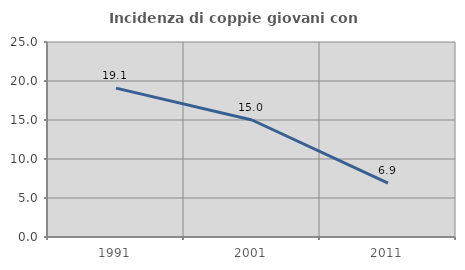
| Category | Incidenza di coppie giovani con figli |
|---|---|
| 1991.0 | 19.084 |
| 2001.0 | 15 |
| 2011.0 | 6.897 |